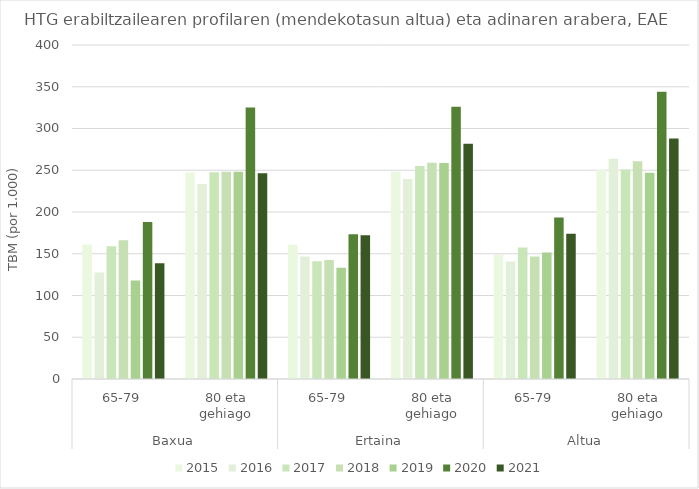
| Category | 2015 | 2016 | 2017 | 2018 | 2019 | 2020 | 2021 |
|---|---|---|---|---|---|---|---|
| 0 | 161.18 | 127.568 | 159.046 | 166.2 | 118.068 | 188.128 | 138.757 |
| 1 | 247.201 | 233.535 | 247.584 | 248.18 | 248.339 | 325.203 | 246.343 |
| 2 | 160.665 | 146.751 | 141.068 | 142.587 | 133.333 | 173.285 | 172.148 |
| 3 | 248.118 | 239.615 | 254.988 | 258.96 | 258.744 | 326.149 | 281.631 |
| 4 | 148.841 | 140.644 | 157.499 | 146.724 | 151.608 | 193.497 | 174.008 |
| 5 | 250.642 | 263.736 | 250.945 | 260.853 | 246.909 | 343.907 | 288.157 |